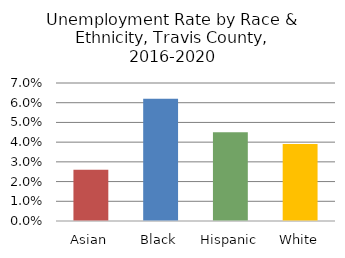
| Category | Series 0 |
|---|---|
| Asian | 0.026 |
| Black | 0.062 |
| Hispanic | 0.045 |
| White | 0.039 |